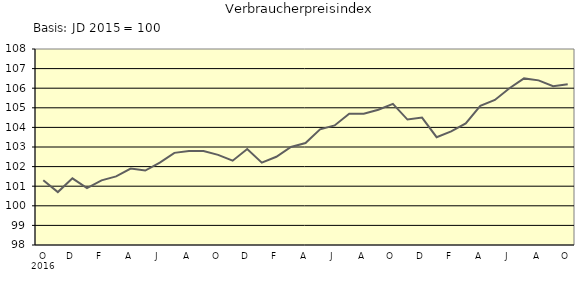
| Category | Series 0 |
|---|---|
| 0 | 101.3 |
| 1 | 100.7 |
| 2 | 101.4 |
| 3 | 100.9 |
| 4 | 101.3 |
| 5 | 101.5 |
| 6 | 101.9 |
| 7 | 101.8 |
| 8 | 102.2 |
| 9 | 102.7 |
| 10 | 102.8 |
| 11 | 102.8 |
| 12 | 102.6 |
| 13 | 102.3 |
| 14 | 102.9 |
| 15 | 102.2 |
| 16 | 102.5 |
| 17 | 103 |
| 18 | 103.2 |
| 19 | 103.9 |
| 20 | 104.1 |
| 21 | 104.7 |
| 22 | 104.7 |
| 23 | 104.9 |
| 24 | 105.2 |
| 25 | 104.4 |
| 26 | 104.5 |
| 27 | 103.5 |
| 28 | 103.8 |
| 29 | 104.2 |
| 30 | 105.1 |
| 31 | 105.4 |
| 32 | 106 |
| 33 | 106.5 |
| 34 | 106.4 |
| 35 | 106.1 |
| 36 | 106.2 |